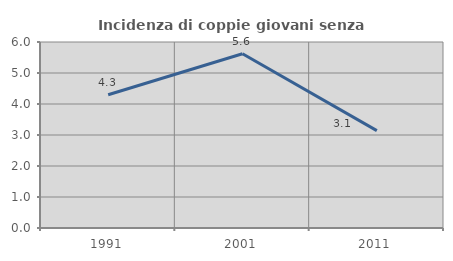
| Category | Incidenza di coppie giovani senza figli |
|---|---|
| 1991.0 | 4.298 |
| 2001.0 | 5.619 |
| 2011.0 | 3.141 |